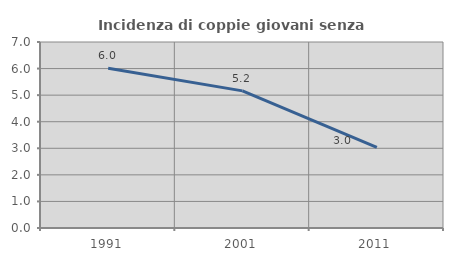
| Category | Incidenza di coppie giovani senza figli |
|---|---|
| 1991.0 | 6.014 |
| 2001.0 | 5.161 |
| 2011.0 | 3.03 |